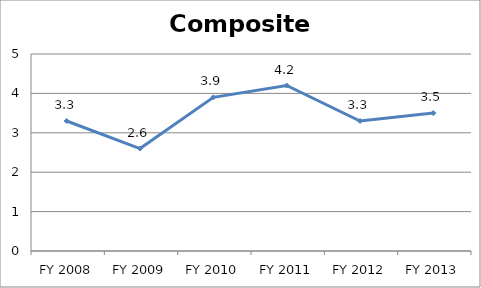
| Category | Composite score |
|---|---|
| FY 2013 | 3.5 |
| FY 2012 | 3.3 |
| FY 2011 | 4.2 |
| FY 2010 | 3.9 |
| FY 2009 | 2.6 |
| FY 2008 | 3.3 |